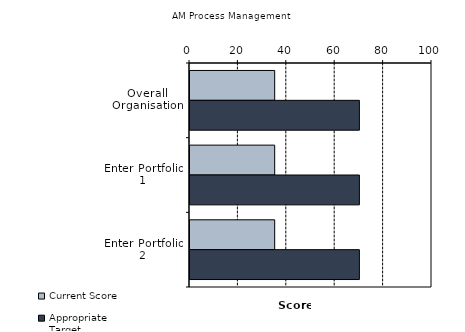
| Category | Current Score | Appropriate Target |
|---|---|---|
| Overall Organisation | 35 | 70 |
| Enter Portfolio 1 | 35 | 70 |
| Enter Portfolio 2 | 35 | 70 |